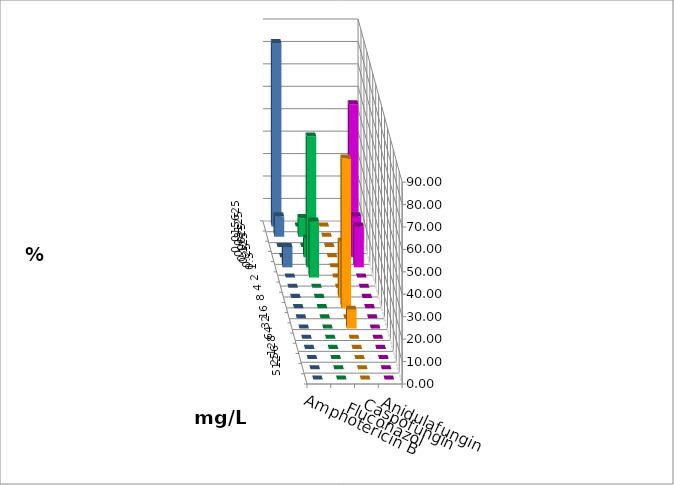
| Category | Amphotericin B | Fluconazol | Caspofungin | Anidulafungin |
|---|---|---|---|---|
| 0.015625 | 0 | 0 | 0 | 81.818 |
| 0.03125 | 8.333 | 0 | 0 | 9.091 |
| 0.0625 | 0 | 0 | 63.636 | 0 |
| 0.125 | 8.333 | 0 | 18.182 | 0 |
| 0.25 | 58.333 | 0 | 18.182 | 9.091 |
| 0.5 | 25 | 0 | 0 | 0 |
| 1.0 | 0 | 0 | 0 | 0 |
| 2.0 | 0 | 25 | 0 | 0 |
| 4.0 | 0 | 66.667 | 0 | 0 |
| 8.0 | 0 | 0 | 0 | 0 |
| 16.0 | 0 | 8.333 | 0 | 0 |
| 32.0 | 0 | 0 | 0 | 0 |
| 64.0 | 0 | 0 | 0 | 0 |
| 128.0 | 0 | 0 | 0 | 0 |
| 256.0 | 0 | 0 | 0 | 0 |
| 512.0 | 0 | 0 | 0 | 0 |